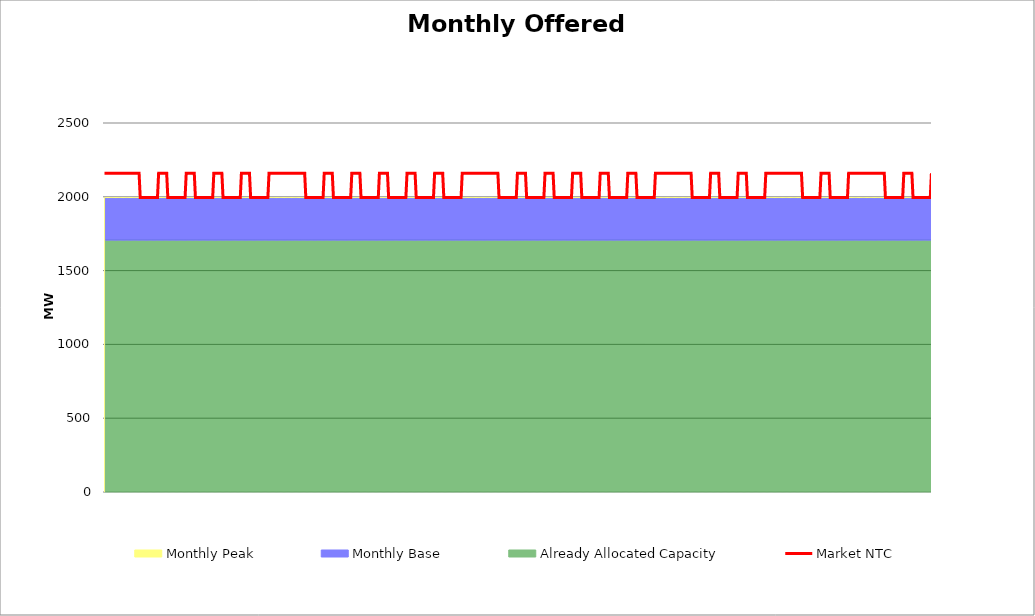
| Category | Market NTC |
|---|---|
| 0 | 2160 |
| 1 | 2160 |
| 2 | 2160 |
| 3 | 2160 |
| 4 | 2160 |
| 5 | 2160 |
| 6 | 2160 |
| 7 | 2160 |
| 8 | 2160 |
| 9 | 2160 |
| 10 | 2160 |
| 11 | 2160 |
| 12 | 2160 |
| 13 | 2160 |
| 14 | 2160 |
| 15 | 2160 |
| 16 | 2160 |
| 17 | 2160 |
| 18 | 2160 |
| 19 | 2160 |
| 20 | 2160 |
| 21 | 2160 |
| 22 | 2160 |
| 23 | 2160 |
| 24 | 2160 |
| 25 | 2160 |
| 26 | 2160 |
| 27 | 2160 |
| 28 | 2160 |
| 29 | 2160 |
| 30 | 2160 |
| 31 | 1995 |
| 32 | 1995 |
| 33 | 1995 |
| 34 | 1995 |
| 35 | 1995 |
| 36 | 1995 |
| 37 | 1995 |
| 38 | 1995 |
| 39 | 1995 |
| 40 | 1995 |
| 41 | 1995 |
| 42 | 1995 |
| 43 | 1995 |
| 44 | 1995 |
| 45 | 1995 |
| 46 | 1995 |
| 47 | 2160 |
| 48 | 2160 |
| 49 | 2160 |
| 50 | 2160 |
| 51 | 2160 |
| 52 | 2160 |
| 53 | 2160 |
| 54 | 2160 |
| 55 | 1995 |
| 56 | 1995 |
| 57 | 1995 |
| 58 | 1995 |
| 59 | 1995 |
| 60 | 1995 |
| 61 | 1995 |
| 62 | 1995 |
| 63 | 1995 |
| 64 | 1995 |
| 65 | 1995 |
| 66 | 1995 |
| 67 | 1995 |
| 68 | 1995 |
| 69 | 1995 |
| 70 | 1995 |
| 71 | 2160 |
| 72 | 2160 |
| 73 | 2160 |
| 74 | 2160 |
| 75 | 2160 |
| 76 | 2160 |
| 77 | 2160 |
| 78 | 2160 |
| 79 | 1995 |
| 80 | 1995 |
| 81 | 1995 |
| 82 | 1995 |
| 83 | 1995 |
| 84 | 1995 |
| 85 | 1995 |
| 86 | 1995 |
| 87 | 1995 |
| 88 | 1995 |
| 89 | 1995 |
| 90 | 1995 |
| 91 | 1995 |
| 92 | 1995 |
| 93 | 1995 |
| 94 | 1995 |
| 95 | 2160 |
| 96 | 2160 |
| 97 | 2160 |
| 98 | 2160 |
| 99 | 2160 |
| 100 | 2160 |
| 101 | 2160 |
| 102 | 2160 |
| 103 | 1995 |
| 104 | 1995 |
| 105 | 1995 |
| 106 | 1995 |
| 107 | 1995 |
| 108 | 1995 |
| 109 | 1995 |
| 110 | 1995 |
| 111 | 1995 |
| 112 | 1995 |
| 113 | 1995 |
| 114 | 1995 |
| 115 | 1995 |
| 116 | 1995 |
| 117 | 1995 |
| 118 | 1995 |
| 119 | 2160 |
| 120 | 2160 |
| 121 | 2160 |
| 122 | 2160 |
| 123 | 2160 |
| 124 | 2160 |
| 125 | 2160 |
| 126 | 2160 |
| 127 | 1995 |
| 128 | 1995 |
| 129 | 1995 |
| 130 | 1995 |
| 131 | 1995 |
| 132 | 1995 |
| 133 | 1995 |
| 134 | 1995 |
| 135 | 1995 |
| 136 | 1995 |
| 137 | 1995 |
| 138 | 1995 |
| 139 | 1995 |
| 140 | 1995 |
| 141 | 1995 |
| 142 | 1995 |
| 143 | 2160 |
| 144 | 2160 |
| 145 | 2160 |
| 146 | 2160 |
| 147 | 2160 |
| 148 | 2160 |
| 149 | 2160 |
| 150 | 2160 |
| 151 | 2160 |
| 152 | 2160 |
| 153 | 2160 |
| 154 | 2160 |
| 155 | 2160 |
| 156 | 2160 |
| 157 | 2160 |
| 158 | 2160 |
| 159 | 2160 |
| 160 | 2160 |
| 161 | 2160 |
| 162 | 2160 |
| 163 | 2160 |
| 164 | 2160 |
| 165 | 2160 |
| 166 | 2160 |
| 167 | 2160 |
| 168 | 2160 |
| 169 | 2160 |
| 170 | 2160 |
| 171 | 2160 |
| 172 | 2160 |
| 173 | 2160 |
| 174 | 2160 |
| 175 | 1995 |
| 176 | 1995 |
| 177 | 1995 |
| 178 | 1995 |
| 179 | 1995 |
| 180 | 1995 |
| 181 | 1995 |
| 182 | 1995 |
| 183 | 1995 |
| 184 | 1995 |
| 185 | 1995 |
| 186 | 1995 |
| 187 | 1995 |
| 188 | 1995 |
| 189 | 1995 |
| 190 | 1995 |
| 191 | 2160 |
| 192 | 2160 |
| 193 | 2160 |
| 194 | 2160 |
| 195 | 2160 |
| 196 | 2160 |
| 197 | 2160 |
| 198 | 2160 |
| 199 | 1995 |
| 200 | 1995 |
| 201 | 1995 |
| 202 | 1995 |
| 203 | 1995 |
| 204 | 1995 |
| 205 | 1995 |
| 206 | 1995 |
| 207 | 1995 |
| 208 | 1995 |
| 209 | 1995 |
| 210 | 1995 |
| 211 | 1995 |
| 212 | 1995 |
| 213 | 1995 |
| 214 | 1995 |
| 215 | 2160 |
| 216 | 2160 |
| 217 | 2160 |
| 218 | 2160 |
| 219 | 2160 |
| 220 | 2160 |
| 221 | 2160 |
| 222 | 2160 |
| 223 | 1995 |
| 224 | 1995 |
| 225 | 1995 |
| 226 | 1995 |
| 227 | 1995 |
| 228 | 1995 |
| 229 | 1995 |
| 230 | 1995 |
| 231 | 1995 |
| 232 | 1995 |
| 233 | 1995 |
| 234 | 1995 |
| 235 | 1995 |
| 236 | 1995 |
| 237 | 1995 |
| 238 | 1995 |
| 239 | 2160 |
| 240 | 2160 |
| 241 | 2160 |
| 242 | 2160 |
| 243 | 2160 |
| 244 | 2160 |
| 245 | 2160 |
| 246 | 2160 |
| 247 | 1995 |
| 248 | 1995 |
| 249 | 1995 |
| 250 | 1995 |
| 251 | 1995 |
| 252 | 1995 |
| 253 | 1995 |
| 254 | 1995 |
| 255 | 1995 |
| 256 | 1995 |
| 257 | 1995 |
| 258 | 1995 |
| 259 | 1995 |
| 260 | 1995 |
| 261 | 1995 |
| 262 | 1995 |
| 263 | 2160 |
| 264 | 2160 |
| 265 | 2160 |
| 266 | 2160 |
| 267 | 2160 |
| 268 | 2160 |
| 269 | 2160 |
| 270 | 2160 |
| 271 | 1995 |
| 272 | 1995 |
| 273 | 1995 |
| 274 | 1995 |
| 275 | 1995 |
| 276 | 1995 |
| 277 | 1995 |
| 278 | 1995 |
| 279 | 1995 |
| 280 | 1995 |
| 281 | 1995 |
| 282 | 1995 |
| 283 | 1995 |
| 284 | 1995 |
| 285 | 1995 |
| 286 | 1995 |
| 287 | 2160 |
| 288 | 2160 |
| 289 | 2160 |
| 290 | 2160 |
| 291 | 2160 |
| 292 | 2160 |
| 293 | 2160 |
| 294 | 2160 |
| 295 | 1995 |
| 296 | 1995 |
| 297 | 1995 |
| 298 | 1995 |
| 299 | 1995 |
| 300 | 1995 |
| 301 | 1995 |
| 302 | 1995 |
| 303 | 1995 |
| 304 | 1995 |
| 305 | 1995 |
| 306 | 1995 |
| 307 | 1995 |
| 308 | 1995 |
| 309 | 1995 |
| 310 | 1995 |
| 311 | 2160 |
| 312 | 2160 |
| 313 | 2160 |
| 314 | 2160 |
| 315 | 2160 |
| 316 | 2160 |
| 317 | 2160 |
| 318 | 2160 |
| 319 | 2160 |
| 320 | 2160 |
| 321 | 2160 |
| 322 | 2160 |
| 323 | 2160 |
| 324 | 2160 |
| 325 | 2160 |
| 326 | 2160 |
| 327 | 2160 |
| 328 | 2160 |
| 329 | 2160 |
| 330 | 2160 |
| 331 | 2160 |
| 332 | 2160 |
| 333 | 2160 |
| 334 | 2160 |
| 335 | 2160 |
| 336 | 2160 |
| 337 | 2160 |
| 338 | 2160 |
| 339 | 2160 |
| 340 | 2160 |
| 341 | 2160 |
| 342 | 2160 |
| 343 | 1995 |
| 344 | 1995 |
| 345 | 1995 |
| 346 | 1995 |
| 347 | 1995 |
| 348 | 1995 |
| 349 | 1995 |
| 350 | 1995 |
| 351 | 1995 |
| 352 | 1995 |
| 353 | 1995 |
| 354 | 1995 |
| 355 | 1995 |
| 356 | 1995 |
| 357 | 1995 |
| 358 | 1995 |
| 359 | 2160 |
| 360 | 2160 |
| 361 | 2160 |
| 362 | 2160 |
| 363 | 2160 |
| 364 | 2160 |
| 365 | 2160 |
| 366 | 2160 |
| 367 | 1995 |
| 368 | 1995 |
| 369 | 1995 |
| 370 | 1995 |
| 371 | 1995 |
| 372 | 1995 |
| 373 | 1995 |
| 374 | 1995 |
| 375 | 1995 |
| 376 | 1995 |
| 377 | 1995 |
| 378 | 1995 |
| 379 | 1995 |
| 380 | 1995 |
| 381 | 1995 |
| 382 | 1995 |
| 383 | 2160 |
| 384 | 2160 |
| 385 | 2160 |
| 386 | 2160 |
| 387 | 2160 |
| 388 | 2160 |
| 389 | 2160 |
| 390 | 2160 |
| 391 | 1995 |
| 392 | 1995 |
| 393 | 1995 |
| 394 | 1995 |
| 395 | 1995 |
| 396 | 1995 |
| 397 | 1995 |
| 398 | 1995 |
| 399 | 1995 |
| 400 | 1995 |
| 401 | 1995 |
| 402 | 1995 |
| 403 | 1995 |
| 404 | 1995 |
| 405 | 1995 |
| 406 | 1995 |
| 407 | 2160 |
| 408 | 2160 |
| 409 | 2160 |
| 410 | 2160 |
| 411 | 2160 |
| 412 | 2160 |
| 413 | 2160 |
| 414 | 2160 |
| 415 | 1995 |
| 416 | 1995 |
| 417 | 1995 |
| 418 | 1995 |
| 419 | 1995 |
| 420 | 1995 |
| 421 | 1995 |
| 422 | 1995 |
| 423 | 1995 |
| 424 | 1995 |
| 425 | 1995 |
| 426 | 1995 |
| 427 | 1995 |
| 428 | 1995 |
| 429 | 1995 |
| 430 | 1995 |
| 431 | 2160 |
| 432 | 2160 |
| 433 | 2160 |
| 434 | 2160 |
| 435 | 2160 |
| 436 | 2160 |
| 437 | 2160 |
| 438 | 2160 |
| 439 | 1995 |
| 440 | 1995 |
| 441 | 1995 |
| 442 | 1995 |
| 443 | 1995 |
| 444 | 1995 |
| 445 | 1995 |
| 446 | 1995 |
| 447 | 1995 |
| 448 | 1995 |
| 449 | 1995 |
| 450 | 1995 |
| 451 | 1995 |
| 452 | 1995 |
| 453 | 1995 |
| 454 | 1995 |
| 455 | 2160 |
| 456 | 2160 |
| 457 | 2160 |
| 458 | 2160 |
| 459 | 2160 |
| 460 | 2160 |
| 461 | 2160 |
| 462 | 2160 |
| 463 | 1995 |
| 464 | 1995 |
| 465 | 1995 |
| 466 | 1995 |
| 467 | 1995 |
| 468 | 1995 |
| 469 | 1995 |
| 470 | 1995 |
| 471 | 1995 |
| 472 | 1995 |
| 473 | 1995 |
| 474 | 1995 |
| 475 | 1995 |
| 476 | 1995 |
| 477 | 1995 |
| 478 | 1995 |
| 479 | 2160 |
| 480 | 2160 |
| 481 | 2160 |
| 482 | 2160 |
| 483 | 2160 |
| 484 | 2160 |
| 485 | 2160 |
| 486 | 2160 |
| 487 | 2160 |
| 488 | 2160 |
| 489 | 2160 |
| 490 | 2160 |
| 491 | 2160 |
| 492 | 2160 |
| 493 | 2160 |
| 494 | 2160 |
| 495 | 2160 |
| 496 | 2160 |
| 497 | 2160 |
| 498 | 2160 |
| 499 | 2160 |
| 500 | 2160 |
| 501 | 2160 |
| 502 | 2160 |
| 503 | 2160 |
| 504 | 2160 |
| 505 | 2160 |
| 506 | 2160 |
| 507 | 2160 |
| 508 | 2160 |
| 509 | 2160 |
| 510 | 2160 |
| 511 | 1995 |
| 512 | 1995 |
| 513 | 1995 |
| 514 | 1995 |
| 515 | 1995 |
| 516 | 1995 |
| 517 | 1995 |
| 518 | 1995 |
| 519 | 1995 |
| 520 | 1995 |
| 521 | 1995 |
| 522 | 1995 |
| 523 | 1995 |
| 524 | 1995 |
| 525 | 1995 |
| 526 | 1995 |
| 527 | 2160 |
| 528 | 2160 |
| 529 | 2160 |
| 530 | 2160 |
| 531 | 2160 |
| 532 | 2160 |
| 533 | 2160 |
| 534 | 2160 |
| 535 | 1995 |
| 536 | 1995 |
| 537 | 1995 |
| 538 | 1995 |
| 539 | 1995 |
| 540 | 1995 |
| 541 | 1995 |
| 542 | 1995 |
| 543 | 1995 |
| 544 | 1995 |
| 545 | 1995 |
| 546 | 1995 |
| 547 | 1995 |
| 548 | 1995 |
| 549 | 1995 |
| 550 | 1995 |
| 551 | 2160 |
| 552 | 2160 |
| 553 | 2160 |
| 554 | 2160 |
| 555 | 2160 |
| 556 | 2160 |
| 557 | 2160 |
| 558 | 2160 |
| 559 | 1995 |
| 560 | 1995 |
| 561 | 1995 |
| 562 | 1995 |
| 563 | 1995 |
| 564 | 1995 |
| 565 | 1995 |
| 566 | 1995 |
| 567 | 1995 |
| 568 | 1995 |
| 569 | 1995 |
| 570 | 1995 |
| 571 | 1995 |
| 572 | 1995 |
| 573 | 1995 |
| 574 | 1995 |
| 575 | 2160 |
| 576 | 2160 |
| 577 | 2160 |
| 578 | 2160 |
| 579 | 2160 |
| 580 | 2160 |
| 581 | 2160 |
| 582 | 2160 |
| 583 | 2160 |
| 584 | 2160 |
| 585 | 2160 |
| 586 | 2160 |
| 587 | 2160 |
| 588 | 2160 |
| 589 | 2160 |
| 590 | 2160 |
| 591 | 2160 |
| 592 | 2160 |
| 593 | 2160 |
| 594 | 2160 |
| 595 | 2160 |
| 596 | 2160 |
| 597 | 2160 |
| 598 | 2160 |
| 599 | 2160 |
| 600 | 2160 |
| 601 | 2160 |
| 602 | 2160 |
| 603 | 2160 |
| 604 | 2160 |
| 605 | 2160 |
| 606 | 2160 |
| 607 | 1995 |
| 608 | 1995 |
| 609 | 1995 |
| 610 | 1995 |
| 611 | 1995 |
| 612 | 1995 |
| 613 | 1995 |
| 614 | 1995 |
| 615 | 1995 |
| 616 | 1995 |
| 617 | 1995 |
| 618 | 1995 |
| 619 | 1995 |
| 620 | 1995 |
| 621 | 1995 |
| 622 | 1995 |
| 623 | 2160 |
| 624 | 2160 |
| 625 | 2160 |
| 626 | 2160 |
| 627 | 2160 |
| 628 | 2160 |
| 629 | 2160 |
| 630 | 2160 |
| 631 | 1995 |
| 632 | 1995 |
| 633 | 1995 |
| 634 | 1995 |
| 635 | 1995 |
| 636 | 1995 |
| 637 | 1995 |
| 638 | 1995 |
| 639 | 1995 |
| 640 | 1995 |
| 641 | 1995 |
| 642 | 1995 |
| 643 | 1995 |
| 644 | 1995 |
| 645 | 1995 |
| 646 | 1995 |
| 647 | 2160 |
| 648 | 2160 |
| 649 | 2160 |
| 650 | 2160 |
| 651 | 2160 |
| 652 | 2160 |
| 653 | 2160 |
| 654 | 2160 |
| 655 | 2160 |
| 656 | 2160 |
| 657 | 2160 |
| 658 | 2160 |
| 659 | 2160 |
| 660 | 2160 |
| 661 | 2160 |
| 662 | 2160 |
| 663 | 2160 |
| 664 | 2160 |
| 665 | 2160 |
| 666 | 2160 |
| 667 | 2160 |
| 668 | 2160 |
| 669 | 2160 |
| 670 | 2160 |
| 671 | 2160 |
| 672 | 2160 |
| 673 | 2160 |
| 674 | 2160 |
| 675 | 2160 |
| 676 | 2160 |
| 677 | 2160 |
| 678 | 2160 |
| 679 | 1995 |
| 680 | 1995 |
| 681 | 1995 |
| 682 | 1995 |
| 683 | 1995 |
| 684 | 1995 |
| 685 | 1995 |
| 686 | 1995 |
| 687 | 1995 |
| 688 | 1995 |
| 689 | 1995 |
| 690 | 1995 |
| 691 | 1995 |
| 692 | 1995 |
| 693 | 1995 |
| 694 | 1995 |
| 695 | 2160 |
| 696 | 2160 |
| 697 | 2160 |
| 698 | 2160 |
| 699 | 2160 |
| 700 | 2160 |
| 701 | 2160 |
| 702 | 2160 |
| 703 | 1995 |
| 704 | 1995 |
| 705 | 1995 |
| 706 | 1995 |
| 707 | 1995 |
| 708 | 1995 |
| 709 | 1995 |
| 710 | 1995 |
| 711 | 1995 |
| 712 | 1995 |
| 713 | 1995 |
| 714 | 1995 |
| 715 | 1995 |
| 716 | 1995 |
| 717 | 1995 |
| 718 | 1995 |
| 719 | 2160 |